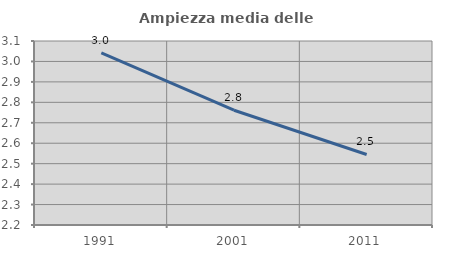
| Category | Ampiezza media delle famiglie |
|---|---|
| 1991.0 | 3.042 |
| 2001.0 | 2.761 |
| 2011.0 | 2.545 |